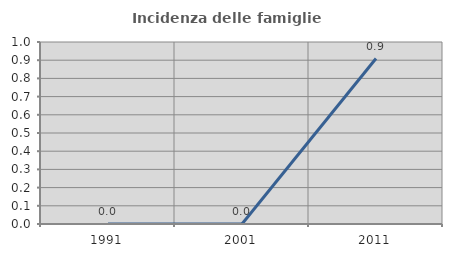
| Category | Incidenza delle famiglie numerose |
|---|---|
| 1991.0 | 0 |
| 2001.0 | 0 |
| 2011.0 | 0.909 |